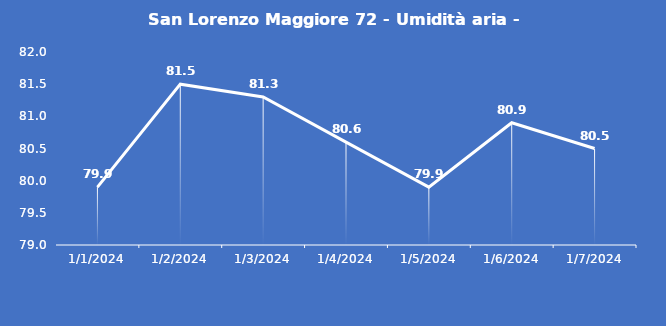
| Category | San Lorenzo Maggiore 72 - Umidità aria - Grezzo (%) |
|---|---|
| 1/1/24 | 79.9 |
| 1/2/24 | 81.5 |
| 1/3/24 | 81.3 |
| 1/4/24 | 80.6 |
| 1/5/24 | 79.9 |
| 1/6/24 | 80.9 |
| 1/7/24 | 80.5 |